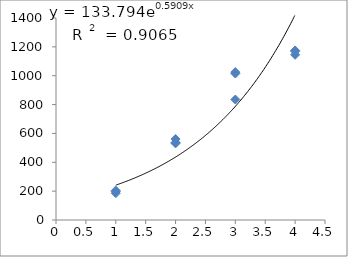
| Category | Series 0 |
|---|---|
| 1.0 | 186 |
| 1.0 | 198 |
| 1.0 | 204 |
| 2.0 | 561 |
| 2.0 | 531 |
| 2.0 | 537 |
| 3.0 | 1015 |
| 3.0 | 1025 |
| 3.0 | 835 |
| 4.0 | 1145 |
| 4.0 | 1170 |
| 4.0 | 1175 |